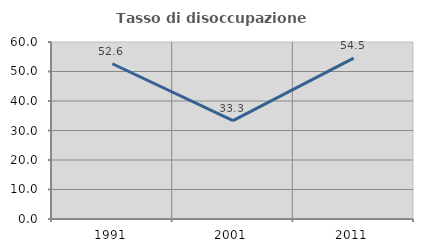
| Category | Tasso di disoccupazione giovanile  |
|---|---|
| 1991.0 | 52.632 |
| 2001.0 | 33.333 |
| 2011.0 | 54.545 |